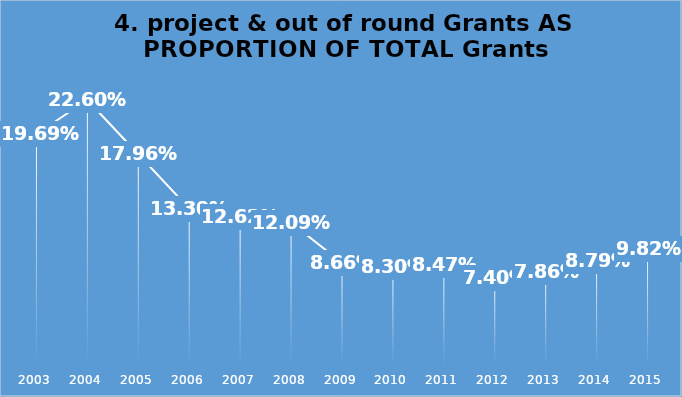
| Category | Series 1 |
|---|---|
| 2003.0 | 0.197 |
| 2004.0 | 0.226 |
| 2005.0 | 0.18 |
| 2006.0 | 0.133 |
| 2007.0 | 0.126 |
| 2008.0 | 0.121 |
| 2009.0 | 0.087 |
| 2010.0 | 0.083 |
| 2011.0 | 0.085 |
| 2012.0 | 0.074 |
| 2013.0 | 0.079 |
| 2014.0 | 0.088 |
| 2015.0 | 0.098 |